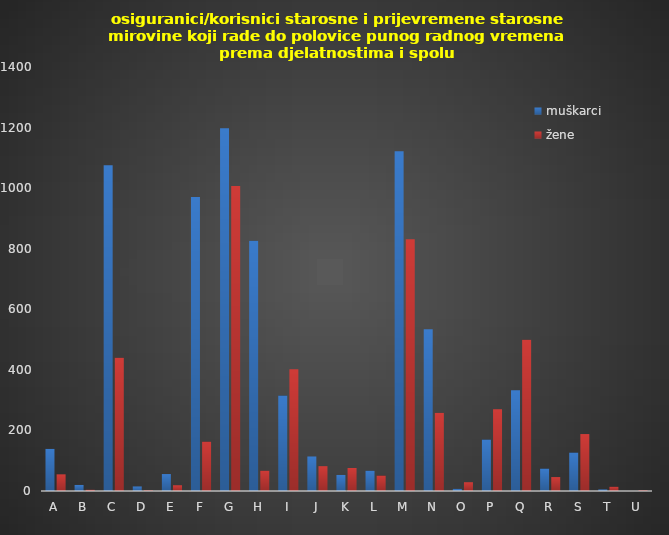
| Category | muškarci | žene |
|---|---|---|
| A | 139 | 55 |
| B | 20 | 4 |
| C | 1076 | 440 |
| D | 15 | 2 |
| E | 56 | 19 |
| F | 971 | 163 |
| G | 1198 | 1007 |
| H | 826 | 67 |
| I | 315 | 402 |
| J | 114 | 82 |
| K | 53 | 76 |
| L | 67 | 51 |
| M | 1122 | 831 |
| N | 534 | 258 |
| O | 7 | 29 |
| P | 170 | 270 |
| Q | 333 | 499 |
| R | 74 | 46 |
| S | 127 | 188 |
| T | 5 | 14 |
| U | 0 | 2 |